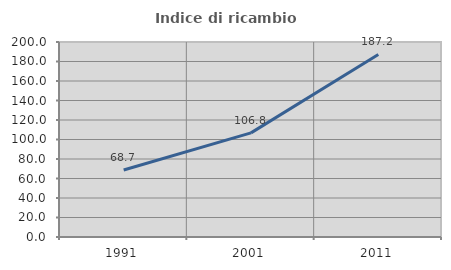
| Category | Indice di ricambio occupazionale  |
|---|---|
| 1991.0 | 68.696 |
| 2001.0 | 106.78 |
| 2011.0 | 187.222 |